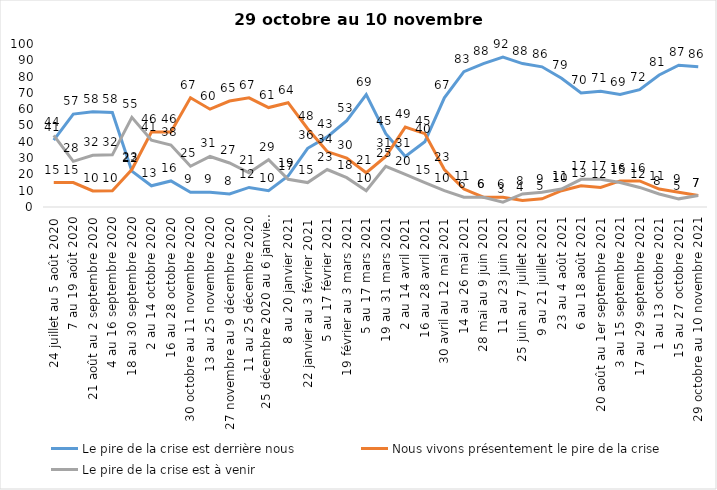
| Category | Le pire de la crise est derrière nous | Nous vivons présentement le pire de la crise | Le pire de la crise est à venir |
|---|---|---|---|
| 24 juillet au 5 août 2020 | 41 | 15 | 44 |
| 7 au 19 août 2020 | 57 | 15 | 28 |
| 21 août au 2 septembre 2020 | 58.39 | 9.84 | 31.77 |
| 4 au 16 septembre 2020 | 58 | 10 | 32 |
| 18 au 30 septembre 2020 | 22 | 23 | 55 |
| 2 au 14 octobre 2020 | 13 | 46 | 41 |
| 16 au 28 octobre 2020 | 16 | 46 | 38 |
| 30 octobre au 11 novembre 2020 | 9 | 67 | 25 |
| 13 au 25 novembre 2020 | 9 | 60 | 31 |
| 27 novembre au 9 décembre 2020 | 8 | 65 | 27 |
| 11 au 25 décembre 2020 | 12 | 67 | 21 |
| 25 décembre 2020 au 6 janvier 2021 | 10 | 61 | 29 |
| 8 au 20 janvier 2021 | 19 | 64 | 17 |
| 22 janvier au 3 février 2021 | 36 | 48 | 15 |
| 5 au 17 février 2021 | 43 | 34 | 23 |
| 19 février au 3 mars 2021 | 53 | 30 | 18 |
| 5 au 17 mars 2021 | 69 | 21 | 10 |
| 19 au 31 mars 2021 | 45 | 31 | 25 |
| 2 au 14 avril 2021 | 31 | 49 | 20 |
| 16 au 28 avril 2021 | 40 | 45 | 15 |
| 30 avril au 12 mai 2021 | 67 | 23 | 10 |
| 14 au 26 mai 2021 | 83 | 11 | 6 |
| 28 mai au 9 juin 2021 | 88 | 6 | 6 |
| 11 au 23 juin 2021 | 92 | 6 | 3 |
| 25 juin au 7 juillet 2021 | 88 | 4 | 8 |
| 9 au 21 juillet 2021 | 86 | 5 | 9 |
| 23 au 4 août 2021 | 79 | 10 | 11 |
| 6 au 18 août 2021 | 70 | 13 | 17 |
| 20 août au 1er septembre 2021 | 71 | 12 | 17 |
| 3 au 15 septembre 2021 | 69 | 16 | 15 |
| 17 au 29 septembre 2021 | 72 | 16 | 12 |
| 1 au 13 octobre 2021 | 81 | 11 | 8 |
| 15 au 27 octobre 2021 | 87 | 9 | 5 |
| 29 octobre au 10 novembre 2021 | 86 | 7 | 7 |